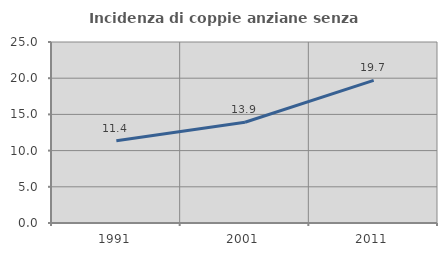
| Category | Incidenza di coppie anziane senza figli  |
|---|---|
| 1991.0 | 11.373 |
| 2001.0 | 13.91 |
| 2011.0 | 19.691 |